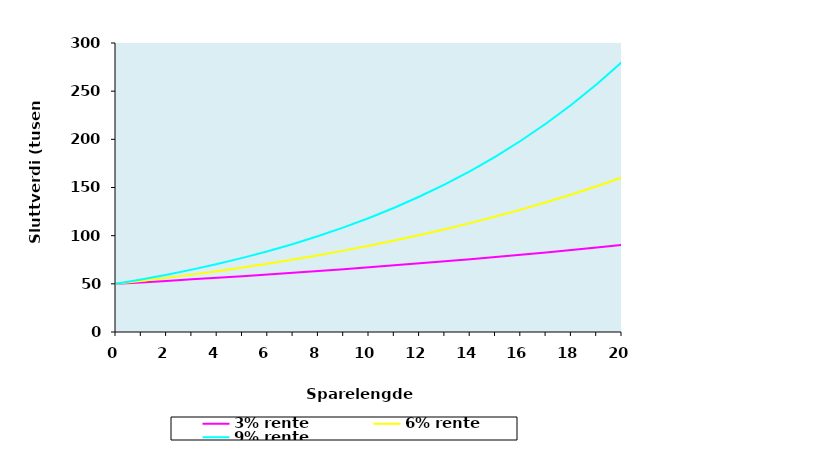
| Category | 3% rente | 6% rente | 9% rente |
|---|---|---|---|
| 0.0 | 50000 | 50000 | 50000 |
| 1.0 | 51500 | 53000 | 54500 |
| 2.0 | 53045 | 56180 | 59405 |
| 3.0 | 54636.35 | 59550.8 | 64751.45 |
| 4.0 | 56275.44 | 63123.848 | 70579.081 |
| 5.0 | 57963.704 | 66911.279 | 76931.198 |
| 6.0 | 59702.615 | 70925.956 | 83855.006 |
| 7.0 | 61493.693 | 75181.513 | 91401.956 |
| 8.0 | 63338.504 | 79692.404 | 99628.132 |
| 9.0 | 65238.659 | 84473.948 | 108594.664 |
| 10.0 | 67195.819 | 89542.385 | 118368.184 |
| 11.0 | 69211.694 | 94914.928 | 129021.32 |
| 12.0 | 71288.044 | 100609.824 | 140633.239 |
| 13.0 | 73426.686 | 106646.413 | 153290.231 |
| 14.0 | 75629.486 | 113045.198 | 167086.351 |
| 15.0 | 77898.371 | 119827.91 | 182124.123 |
| 16.0 | 80235.322 | 127017.584 | 198515.294 |
| 17.0 | 82642.382 | 134638.639 | 216381.671 |
| 18.0 | 85121.653 | 142716.958 | 235856.021 |
| 19.0 | 87675.303 | 151279.975 | 257083.063 |
| 20.0 | 90305.562 | 160356.774 | 280220.538 |